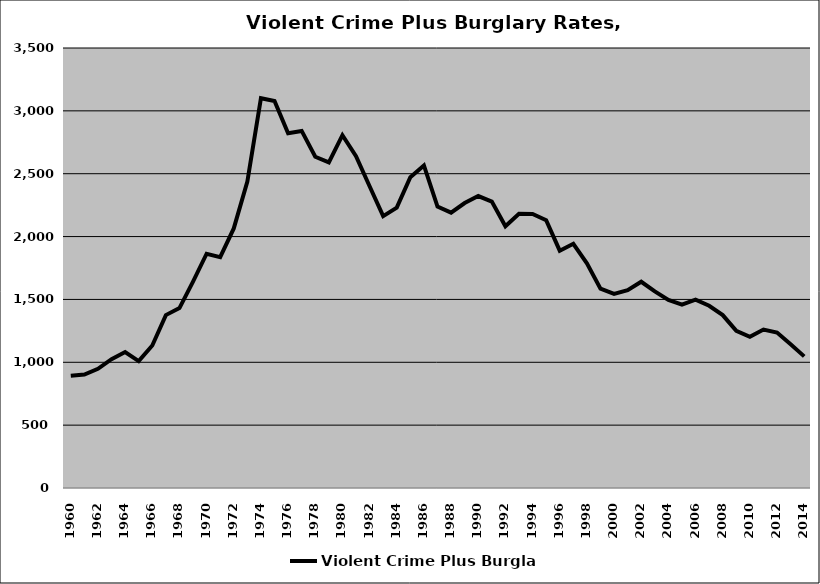
| Category | Violent Crime Plus Burglary |
|---|---|
| 1960.0 | 893.131 |
| 1961.0 | 902.229 |
| 1962.0 | 947.846 |
| 1963.0 | 1024.439 |
| 1964.0 | 1081.214 |
| 1965.0 | 1008.769 |
| 1966.0 | 1133.375 |
| 1967.0 | 1375.459 |
| 1968.0 | 1431.018 |
| 1969.0 | 1641.76 |
| 1970.0 | 1863.376 |
| 1971.0 | 1836.452 |
| 1972.0 | 2064.781 |
| 1973.0 | 2438.192 |
| 1974.0 | 3100.743 |
| 1975.0 | 3077.743 |
| 1976.0 | 2821.894 |
| 1977.0 | 2840.287 |
| 1978.0 | 2634.622 |
| 1979.0 | 2589.551 |
| 1980.0 | 2806.261 |
| 1981.0 | 2640.064 |
| 1982.0 | 2400.21 |
| 1983.0 | 2162.74 |
| 1984.0 | 2230.036 |
| 1985.0 | 2472.137 |
| 1986.0 | 2565.963 |
| 1987.0 | 2238.659 |
| 1988.0 | 2190.421 |
| 1989.0 | 2266.704 |
| 1990.0 | 2322.284 |
| 1991.0 | 2278.213 |
| 1992.0 | 2082.49 |
| 1993.0 | 2180.539 |
| 1994.0 | 2179.387 |
| 1995.0 | 2130.322 |
| 1996.0 | 1887.827 |
| 1997.0 | 1942.656 |
| 1998.0 | 1787.471 |
| 1999.0 | 1585.428 |
| 2000.0 | 1543.338 |
| 2001.0 | 1573.328 |
| 2002.0 | 1640.433 |
| 2003.0 | 1563.856 |
| 2004.0 | 1495.45 |
| 2005.0 | 1458.187 |
| 2006.0 | 1498.414 |
| 2007.0 | 1449.812 |
| 2008.0 | 1375.501 |
| 2009.0 | 1249.83 |
| 2010.0 | 1202.375 |
| 2011.0 | 1259.936 |
| 2012.0 | 1236.241 |
| 2013.0 | 1143.452 |
| 2014.0 | 1046.991 |